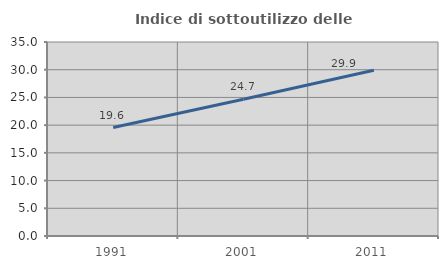
| Category | Indice di sottoutilizzo delle abitazioni  |
|---|---|
| 1991.0 | 19.574 |
| 2001.0 | 24.687 |
| 2011.0 | 29.892 |